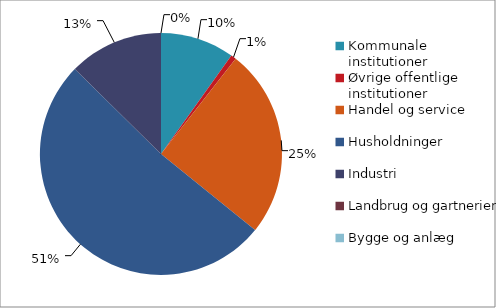
| Category | Series 0 |
|---|---|
| Kommunale institutioner | 24464 |
| Øvrige offentlige institutioner | 1745 |
| Handel og service | 62522 |
| Husholdninger | 127666 |
| Industri | 31258 |
| Landbrug og gartnerier | 0 |
| Bygge og anlæg | 0 |